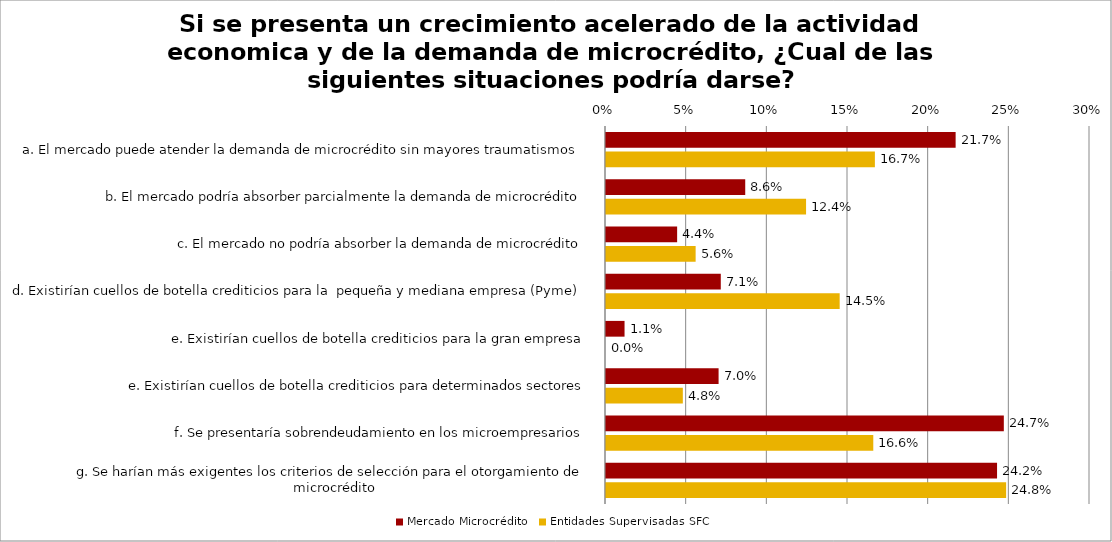
| Category | Mercado Microcrédito | Entidades Supervisadas SFC |
|---|---|---|
| a. El mercado puede atender la demanda de microcrédito sin mayores traumatismos | 0.217 | 0.167 |
| b. El mercado podría absorber parcialmente la demanda de microcrédito | 0.086 | 0.124 |
| c. El mercado no podría absorber la demanda de microcrédito | 0.044 | 0.056 |
| d. Existirían cuellos de botella crediticios para la  pequeña y mediana empresa (Pyme) | 0.071 | 0.145 |
| e. Existirían cuellos de botella crediticios para la gran empresa | 0.011 | 0 |
| e. Existirían cuellos de botella crediticios para determinados sectores | 0.07 | 0.048 |
| f. Se presentaría sobrendeudamiento en los microempresarios | 0.247 | 0.166 |
| g. Se harían más exigentes los criterios de selección para el otorgamiento de microcrédito | 0.242 | 0.248 |